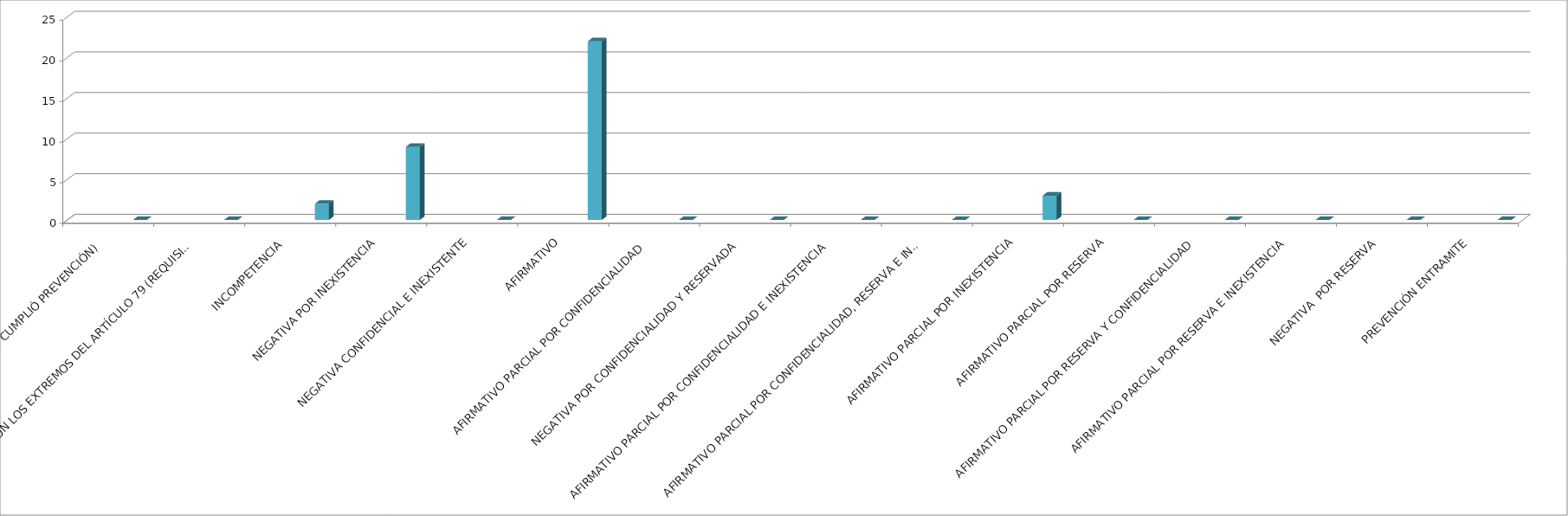
| Category | Series 0 | Series 1 | Series 2 | Series 3 | Series 4 |
|---|---|---|---|---|---|
| SE TIENE POR NO PRESENTADA ( NO CUMPLIÓ PREVENCIÓN) |  |  |  |  | 0 |
| NO CUMPLIO CON LOS EXTREMOS DEL ARTÍCULO 79 (REQUISITOS) |  |  |  |  | 0 |
| INCOMPETENCIA  |  |  |  |  | 2 |
| NEGATIVA POR INEXISTENCIA |  |  |  |  | 9 |
| NEGATIVA CONFIDENCIAL E INEXISTENTE |  |  |  |  | 0 |
| AFIRMATIVO |  |  |  |  | 22 |
| AFIRMATIVO PARCIAL POR CONFIDENCIALIDAD  |  |  |  |  | 0 |
| NEGATIVA POR CONFIDENCIALIDAD Y RESERVADA |  |  |  |  | 0 |
| AFIRMATIVO PARCIAL POR CONFIDENCIALIDAD E INEXISTENCIA |  |  |  |  | 0 |
| AFIRMATIVO PARCIAL POR CONFIDENCIALIDAD, RESERVA E INEXISTENCIA |  |  |  |  | 0 |
| AFIRMATIVO PARCIAL POR INEXISTENCIA |  |  |  |  | 3 |
| AFIRMATIVO PARCIAL POR RESERVA |  |  |  |  | 0 |
| AFIRMATIVO PARCIAL POR RESERVA Y CONFIDENCIALIDAD |  |  |  |  | 0 |
| AFIRMATIVO PARCIAL POR RESERVA E INEXISTENCIA |  |  |  |  | 0 |
| NEGATIVA  POR RESERVA |  |  |  |  | 0 |
| PREVENCIÓN ENTRAMITE |  |  |  |  | 0 |